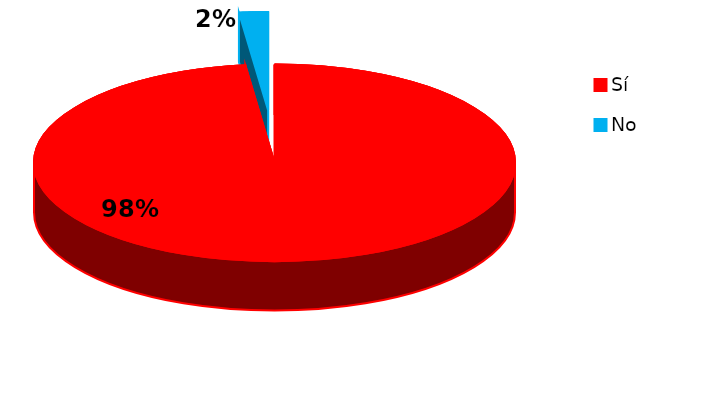
| Category | Series 0 |
|---|---|
| 0 | 152 |
| 1 | 3 |